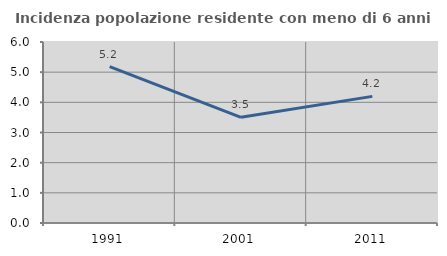
| Category | Incidenza popolazione residente con meno di 6 anni |
|---|---|
| 1991.0 | 5.186 |
| 2001.0 | 3.503 |
| 2011.0 | 4.198 |